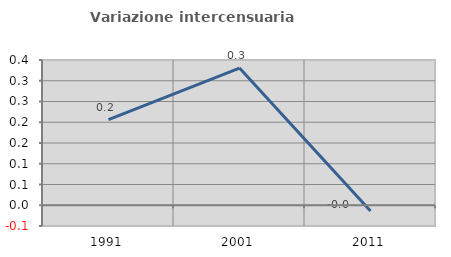
| Category | Variazione intercensuaria annua |
|---|---|
| 1991.0 | 0.207 |
| 2001.0 | 0.33 |
| 2011.0 | -0.014 |